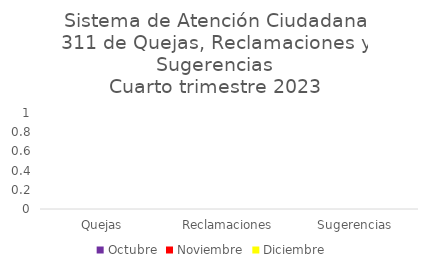
| Category | Octubre | Noviembre | Diciembre |
|---|---|---|---|
| Quejas | 0 | 0 | 0 |
| Reclamaciones | 0 | 0 | 0 |
| Sugerencias | 0 | 0 | 0 |